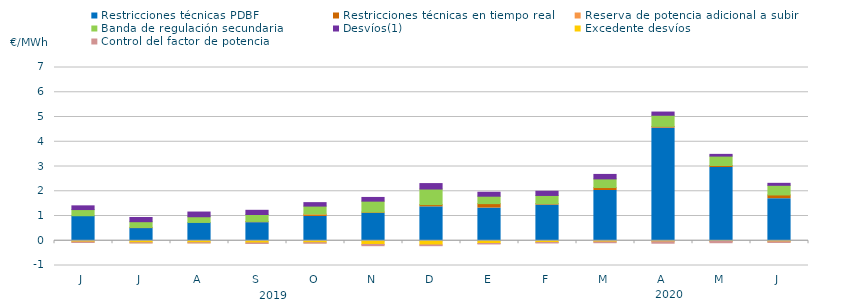
| Category | Restricciones técnicas PDBF | Restricciones técnicas en tiempo real | Reserva de potencia adicional a subir | Banda de regulación secundaria | Desvíos(1) | Excedente desvíos | Control del factor de potencia |
|---|---|---|---|---|---|---|---|
| J | 1 | 0.01 | 0 | 0.25 | 0.15 | -0.05 | -0.06 |
| J | 0.51 | 0.02 | 0.01 | 0.23 | 0.17 | -0.08 | -0.05 |
| A | 0.73 | 0.01 | 0 | 0.23 | 0.19 | -0.08 | -0.05 |
| S | 0.73 | 0.05 | 0 | 0.28 | 0.17 | -0.09 | -0.06 |
| O | 0.98 | 0.07 | 0.03 | 0.32 | 0.14 | -0.08 | -0.06 |
| N | 1.11 | 0.05 | 0 | 0.44 | 0.15 | -0.15 | -0.09 |
| D | 1.37 | 0.09 | 0 | 0.63 | 0.22 | -0.17 | -0.07 |
| E | 1.32 | 0.18 | 0 | 0.3 | 0.16 | -0.11 | -0.06 |
| F | 1.44 | 0.06 | 0 | 0.33 | 0.17 | -0.07 | -0.06 |
| M | 2.03 | 0.12 | 0 | 0.35 | 0.18 | -0.05 | -0.07 |
| A | 4.55 | 0.07 | 0 | 0.45 | 0.13 | -0.04 | -0.1 |
| M | 2.96 | 0.08 | 0 | 0.38 | 0.07 | -0.03 | -0.09 |
| J | 1.7 | 0.15 | 0 | 0.39 | 0.08 | -0.04 | -0.07 |